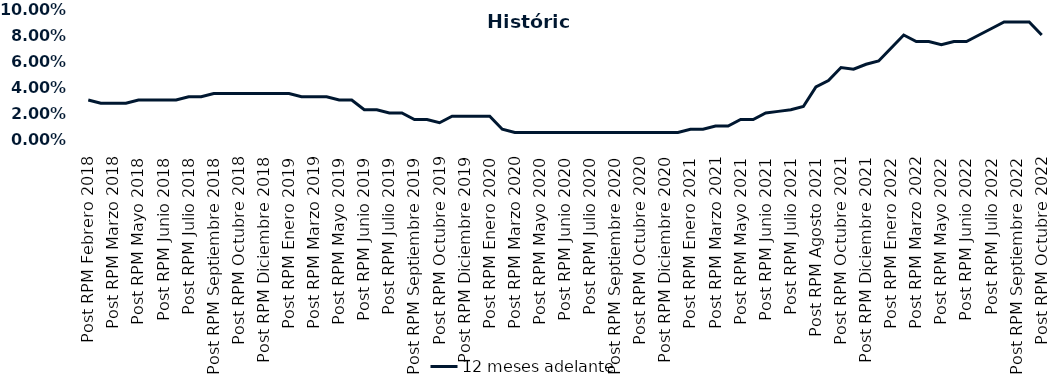
| Category | 12 meses adelante  |
|---|---|
| Post RPM Febrero 2018 | 0.03 |
| Pre RPM Marzo 2018 | 0.028 |
| Post RPM Marzo 2018 | 0.028 |
| Pre RPM Mayo 2018 | 0.028 |
| Post RPM Mayo 2018 | 0.03 |
| Pre RPM Junio 2018 | 0.03 |
| Post RPM Junio 2018 | 0.03 |
| Pre RPM Julio 2018 | 0.03 |
| Post RPM Julio 2018 | 0.032 |
| Pre RPM Septiembre 2018 | 0.032 |
| Post RPM Septiembre 2018 | 0.035 |
| Pre RPM Octubre 2018 | 0.035 |
| Post RPM Octubre 2018 | 0.035 |
| Pre RPM Diciembre 2018 | 0.035 |
| Post RPM Diciembre 2018 | 0.035 |
| Pre RPM Enero 2019 | 0.035 |
| Post RPM Enero 2019 | 0.035 |
| Pre RPM Marzo 2019 | 0.032 |
| Post RPM Marzo 2019 | 0.032 |
| Pre RPM Mayo 2019 | 0.032 |
| Post RPM Mayo 2019 | 0.03 |
| Pre RPM Junio 2019 | 0.03 |
| Post RPM Junio 2019 | 0.022 |
| Pre RPM Julio 2019 | 0.022 |
| Post RPM Julio 2019 | 0.02 |
| Pre RPM Septiembre 2019 | 0.02 |
| Post RPM Septiembre 2019 | 0.015 |
| Pre RPM Octubre 2019 | 0.015 |
| Post RPM Octubre 2019 | 0.012 |
| Pre RPM Diciembre 2019 | 0.018 |
| Post RPM Diciembre 2019 | 0.018 |
| Pre RPM Enero 2020 | 0.018 |
| Post RPM Enero 2020 | 0.018 |
| Pre RPM Marzo 2020 | 0.008 |
| Post RPM Marzo 2020 | 0.005 |
| Pre RPM Mayo 2020 | 0.005 |
| Post RPM Mayo 2020 | 0.005 |
| Pre RPM Junio 2020 | 0.005 |
| Post RPM Junio 2020 | 0.005 |
| Pre RPM Julio 2020 | 0.005 |
| Post RPM Julio 2020 | 0.005 |
| Pre RPM Septiembre 2020 | 0.005 |
| Post RPM Septiembre 2020 | 0.005 |
| Pre RPM Octubre 2020 | 0.005 |
| Post RPM Octubre 2020 | 0.005 |
| Pre RPM Diciembre 2020 | 0.005 |
| Post RPM Diciembre 2020 | 0.005 |
| Pre RPM Enero 2021 | 0.005 |
| Post RPM Enero 2021 | 0.008 |
| Pre RPM Marzo 2021 | 0.008 |
| Post RPM Marzo 2021 | 0.01 |
| Pre RPM Mayo 2021 | 0.01 |
| Post RPM Mayo 2021 | 0.015 |
| Pre RPM Junio 2021 | 0.015 |
| Post RPM Junio 2021 | 0.02 |
| Pre RPM Julio 2021 | 0.021 |
| Post RPM Julio 2021 | 0.022 |
| Pre RPM Agosto 2021 | 0.025 |
| Post RPM Agosto 2021 | 0.04 |
| Pre RPM Octubre 2021 | 0.045 |
| Post RPM Octubre 2021 | 0.055 |
| Pre RPM Diciembre 2021 | 0.054 |
| Post RPM Diciembre 2021 | 0.058 |
| Pre RPM Enero 2022 | 0.06 |
| Post RPM Enero 2022 | 0.07 |
| Pre RPM Marzo 2022 | 0.08 |
| Post RPM Marzo 2022 | 0.075 |
| Pre RPM Mayo 2022 | 0.075 |
| Post RPM Mayo 2022 | 0.072 |
| Pre RPM Junio 2022 | 0.075 |
| Post RPM Junio 2022 | 0.075 |
| Pre RPM Julio 2022 | 0.08 |
| Post RPM Julio 2022 | 0.085 |
| Pre RPM Septiembre 2022 | 0.09 |
| Post RPM Septiembre 2022 | 0.09 |
| Pre RPM Octubre 2022 | 0.09 |
| Post RPM Octubre 2022 | 0.08 |